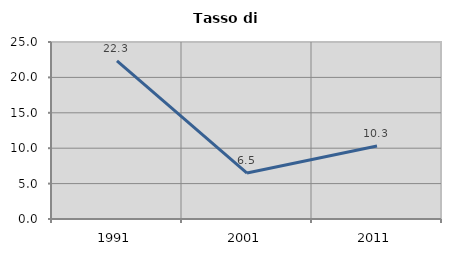
| Category | Tasso di disoccupazione   |
|---|---|
| 1991.0 | 22.33 |
| 2001.0 | 6.494 |
| 2011.0 | 10.309 |